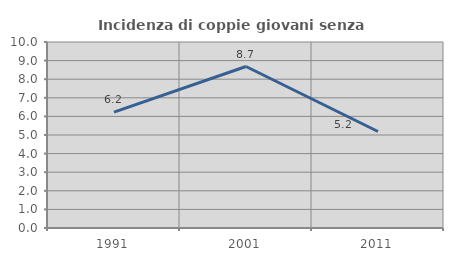
| Category | Incidenza di coppie giovani senza figli |
|---|---|
| 1991.0 | 6.231 |
| 2001.0 | 8.683 |
| 2011.0 | 5.187 |